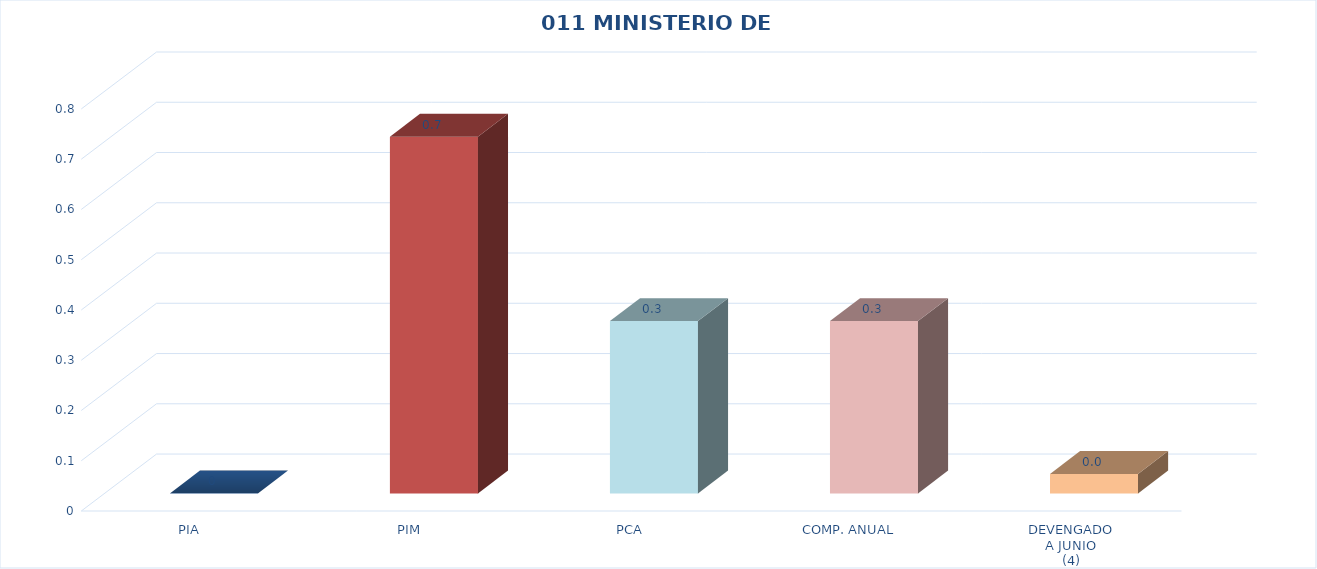
| Category | 011 MINISTERIO DE SALUD |
|---|---|
| PIA | 0 |
| PIM | 0.71 |
| PCA | 0.343 |
| COMP. ANUAL | 0.343 |
| DEVENGADO
A JUNIO
(4) | 0.039 |